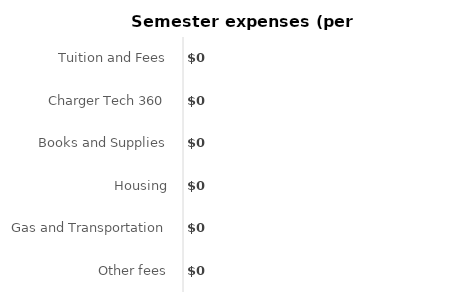
| Category | Series 0 |
|---|---|
| Tuition and Fees | 0 |
| Charger Tech 360 | 0 |
| Books and Supplies | 0 |
| Housing | 0 |
| Gas and Transportation | 0 |
| Other fees | 0 |